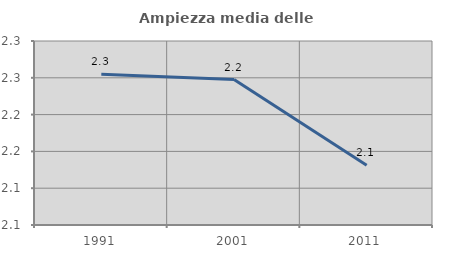
| Category | Ampiezza media delle famiglie |
|---|---|
| 1991.0 | 2.255 |
| 2001.0 | 2.248 |
| 2011.0 | 2.131 |